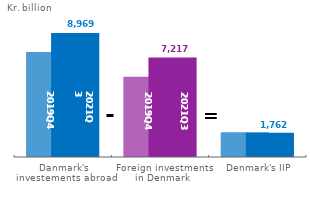
| Category | 2019Q4 | 2021Q3 |
|---|---|---|
| Danmark's investements abroad | 7609.91 | 8979.115 |
| Foreign investments in Denmark | 5813.25 | 7217.281 |
| Denmark's IIP | 1796.66 | 1761.835 |